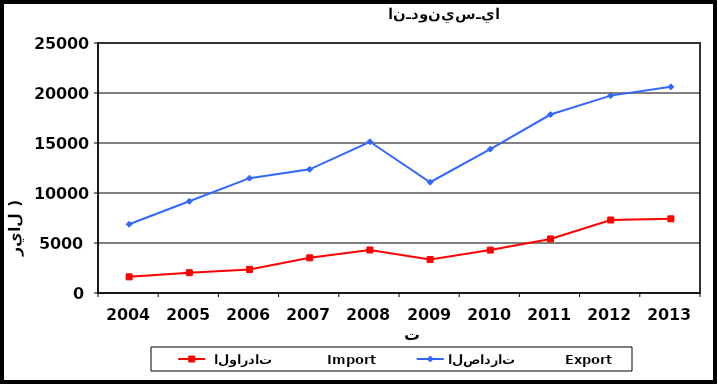
| Category |  الواردات           Import | الصادرات          Export |
|---|---|---|
| 2004.0 | 1614 | 6871 |
| 2005.0 | 2030 | 9170 |
| 2006.0 | 2354 | 11484 |
| 2007.0 | 3516 | 12366 |
| 2008.0 | 4301 | 15122 |
| 2009.0 | 3342 | 11079 |
| 2010.0 | 4291 | 14388 |
| 2011.0 | 5407 | 17847 |
| 2012.0 | 7301 | 19739 |
| 2013.0 | 7417 | 20615 |